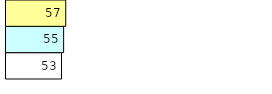
| Category | Total Standouts | Total Recd | Total Tipsters |
|---|---|---|---|
| 0 | 53 | 55 | 57 |